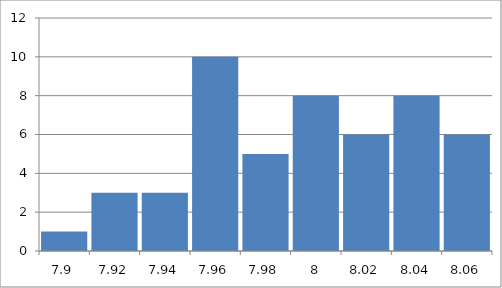
| Category | Series 0 |
|---|---|
| 7.9 | 1 |
| 7.92 | 3 |
| 7.94 | 3 |
| 7.96 | 10 |
| 7.98 | 5 |
| 8.0 | 8 |
| 8.02 | 6 |
| 8.04 | 8 |
| 8.06 | 6 |